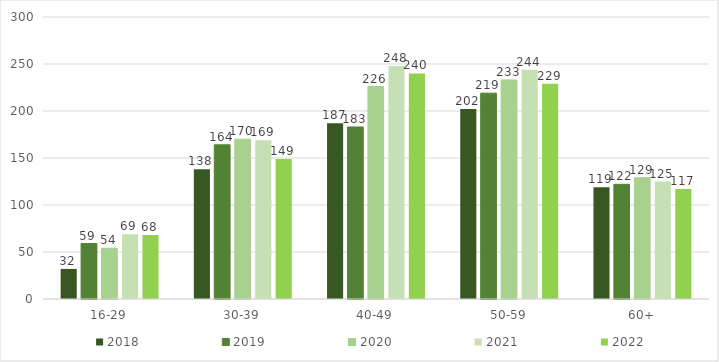
| Category | 2018 | 2019 | 2020 | 2021 | 2022 |
|---|---|---|---|---|---|
| 16-29 | 32 | 59 | 54 | 69 | 68 |
| 30-39 | 138 | 164 | 170 | 169 | 149 |
| 40-49 | 187 | 183 | 226 | 248 | 240 |
| 50-59 | 202 | 219 | 233 | 244 | 229 |
| 60+ | 119 | 122 | 129 | 125 | 117 |